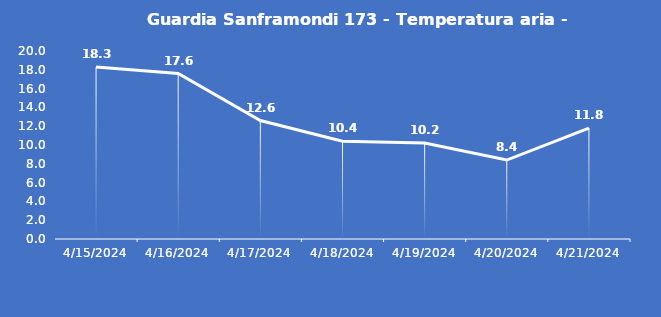
| Category | Guardia Sanframondi 173 - Temperatura aria - Grezzo (°C) |
|---|---|
| 4/15/24 | 18.3 |
| 4/16/24 | 17.6 |
| 4/17/24 | 12.6 |
| 4/18/24 | 10.4 |
| 4/19/24 | 10.2 |
| 4/20/24 | 8.4 |
| 4/21/24 | 11.8 |